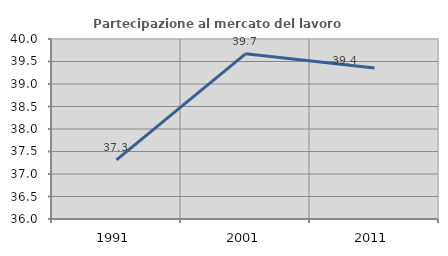
| Category | Partecipazione al mercato del lavoro  femminile |
|---|---|
| 1991.0 | 37.313 |
| 2001.0 | 39.671 |
| 2011.0 | 39.358 |